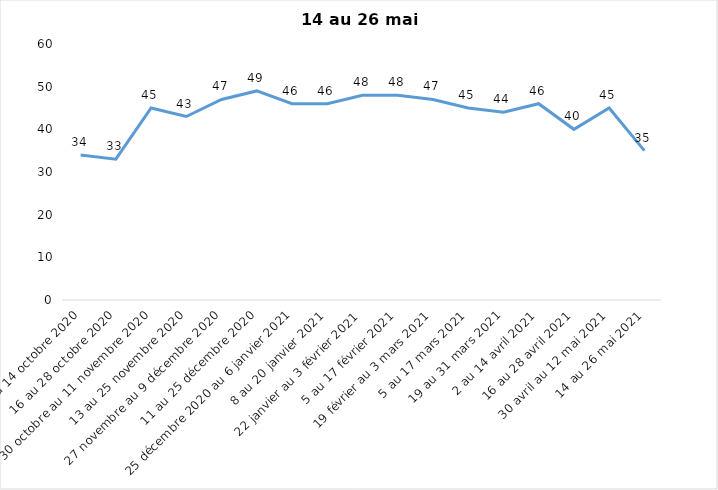
| Category | Toujours aux trois mesures |
|---|---|
| 2 au 14 octobre 2020 | 34 |
| 16 au 28 octobre 2020 | 33 |
| 30 octobre au 11 novembre 2020 | 45 |
| 13 au 25 novembre 2020 | 43 |
| 27 novembre au 9 décembre 2020 | 47 |
| 11 au 25 décembre 2020 | 49 |
| 25 décembre 2020 au 6 janvier 2021 | 46 |
| 8 au 20 janvier 2021 | 46 |
| 22 janvier au 3 février 2021 | 48 |
| 5 au 17 février 2021 | 48 |
| 19 février au 3 mars 2021 | 47 |
| 5 au 17 mars 2021 | 45 |
| 19 au 31 mars 2021 | 44 |
| 2 au 14 avril 2021 | 46 |
| 16 au 28 avril 2021 | 40 |
| 30 avril au 12 mai 2021 | 45 |
| 14 au 26 mai 2021 | 35 |